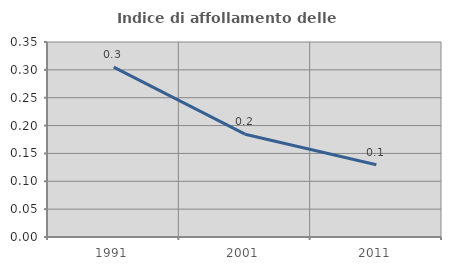
| Category | Indice di affollamento delle abitazioni  |
|---|---|
| 1991.0 | 0.305 |
| 2001.0 | 0.185 |
| 2011.0 | 0.13 |